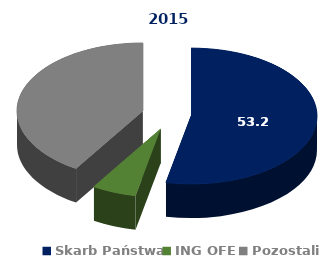
| Category | 2015 |
|---|---|
| Skarb Państwa | 53.2 |
| ING OFE | 5.7 |
| Pozostali | 41.1 |